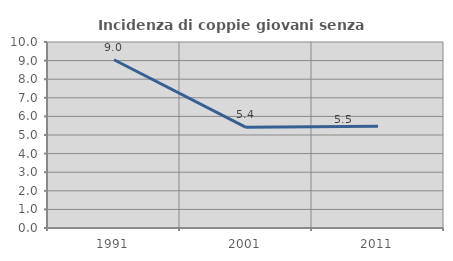
| Category | Incidenza di coppie giovani senza figli |
|---|---|
| 1991.0 | 9.044 |
| 2001.0 | 5.411 |
| 2011.0 | 5.477 |